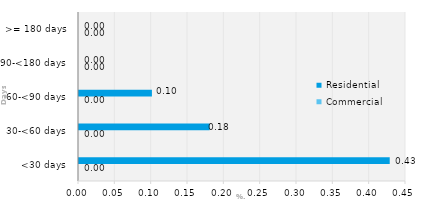
| Category | Commercial | Residential |
|---|---|---|
| <30 days | 0 | 0.428 |
| 30-<60 days | 0 | 0.18 |
| 60-<90 days | 0 | 0.1 |
| 90-<180 days | 0 | 0 |
| >= 180 days | 0 | 0 |